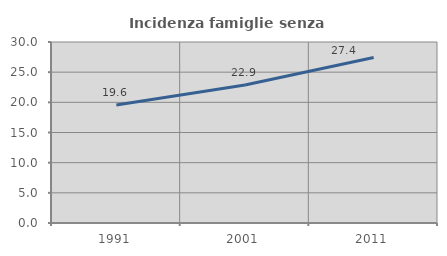
| Category | Incidenza famiglie senza nuclei |
|---|---|
| 1991.0 | 19.555 |
| 2001.0 | 22.878 |
| 2011.0 | 27.424 |